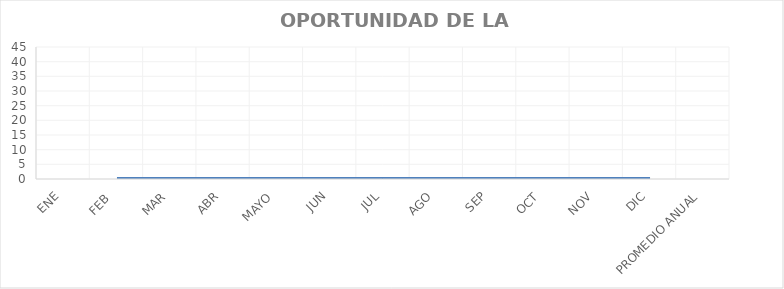
| Category | OPORTUNIDAD DE LA REMISIÓN |
|---|---|
| ENE | 0 |
| FEB  | 0 |
| MAR | 0 |
| ABR | 0 |
| MAYO | 0 |
| JUN | 0 |
| JUL | 0 |
| AGO | 0 |
| SEP | 0 |
| OCT | 0 |
| NOV | 0 |
| DIC | 0 |
| PROMEDIO ANUAL | 0 |